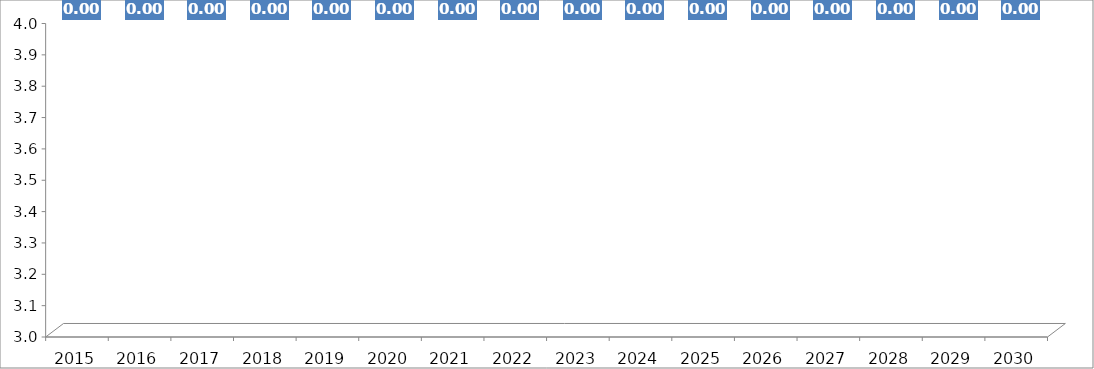
| Category | Series 0 |
|---|---|
| 2015.0 | 0 |
| 2016.0 | 0 |
| 2017.0 | 0 |
| 2018.0 | 0 |
| 2019.0 | 0 |
| 2020.0 | 0 |
| 2021.0 | 0 |
| 2022.0 | 0 |
| 2023.0 | 0 |
| 2024.0 | 0 |
| 2025.0 | 0 |
| 2026.0 | 0 |
| 2027.0 | 0 |
| 2028.0 | 0 |
| 2029.0 | 0 |
| 2030.0 | 0 |